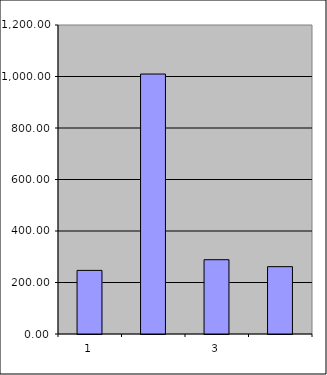
| Category | Series 0 |
|---|---|
| 0 | 247 |
| 1 | 1009.544 |
| 2 | 288.529 |
| 3 | 261.497 |